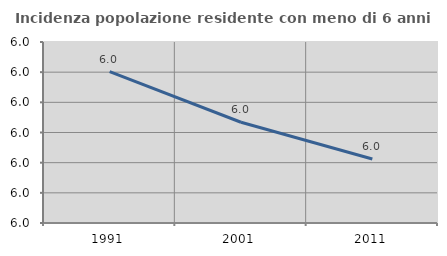
| Category | Incidenza popolazione residente con meno di 6 anni |
|---|---|
| 1991.0 | 5.98 |
| 2001.0 | 5.972 |
| 2011.0 | 5.966 |